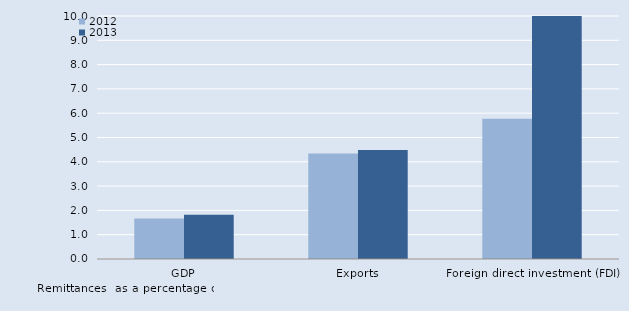
| Category | 2012 | 2013 |
|---|---|---|
| GDP | 1.665 | 1.82 |
| Exports | 4.339 | 4.487 |
| Foreign direct investment (FDI) | 5.769 | 10.016 |